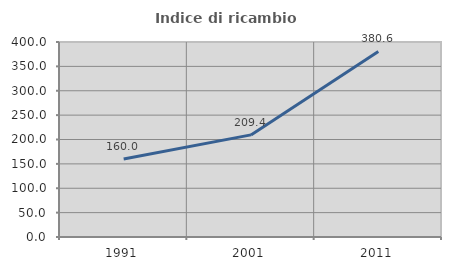
| Category | Indice di ricambio occupazionale  |
|---|---|
| 1991.0 | 160 |
| 2001.0 | 209.434 |
| 2011.0 | 380.645 |